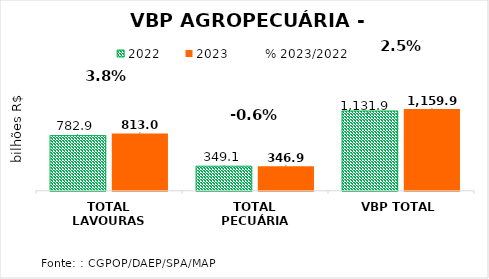
| Category | 2022 | 2023 |
|---|---|---|
| TOTAL LAVOURAS | 782.883 | 813.02 |
| TOTAL PECUÁRIA | 349.065 | 346.958 |
| VBP TOTAL | 1131.948 | 1159.978 |